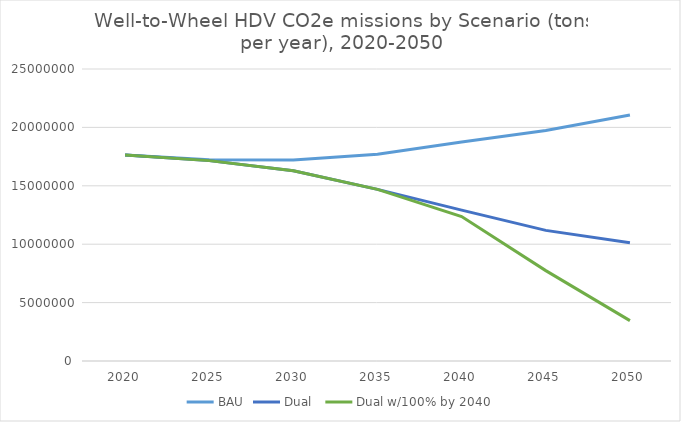
| Category | BAU | Dual  | Dual w/100% by 2040 |
|---|---|---|---|
| 2020.0 | 17642785.897 | 17642785.897 | 17642785.897 |
| 2025.0 | 17229946.161 | 17155202.451 | 17155202.451 |
| 2030.0 | 17217029.73 | 16291370.896 | 16291370.896 |
| 2035.0 | 17705091.677 | 14696259.879 | 14696259.879 |
| 2040.0 | 18749016.551 | 12918173.069 | 12366693.899 |
| 2045.0 | 19733526.91 | 11182435.35 | 7738084.468 |
| 2050.0 | 21067716.487 | 10118786.137 | 3454097.238 |